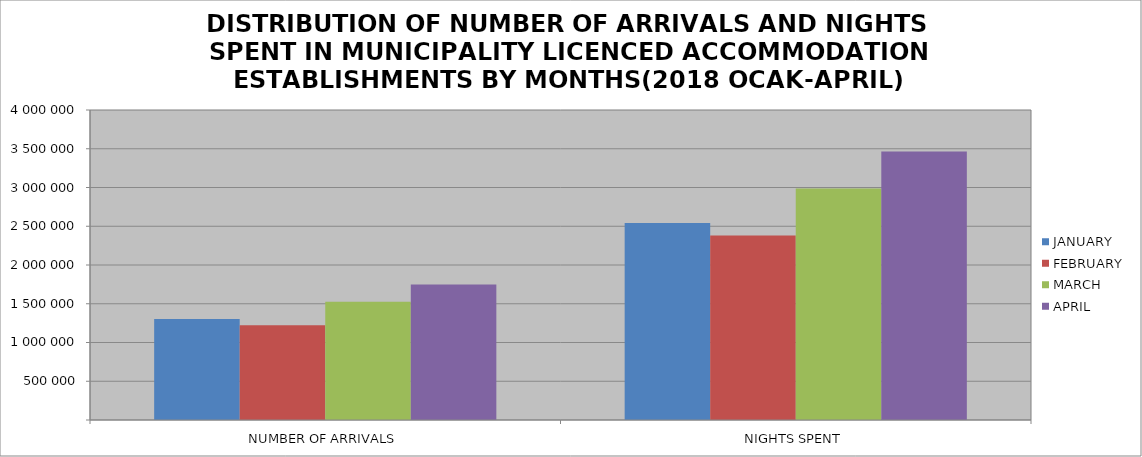
| Category | JANUARY | FEBRUARY | MARCH | APRIL |
|---|---|---|---|---|
| NUMBER OF ARRIVALS | 1303353 | 1223475 | 1526172 | 1749085 |
| NIGHTS SPENT | 2542103 | 2381300 | 2986820 | 3463261 |